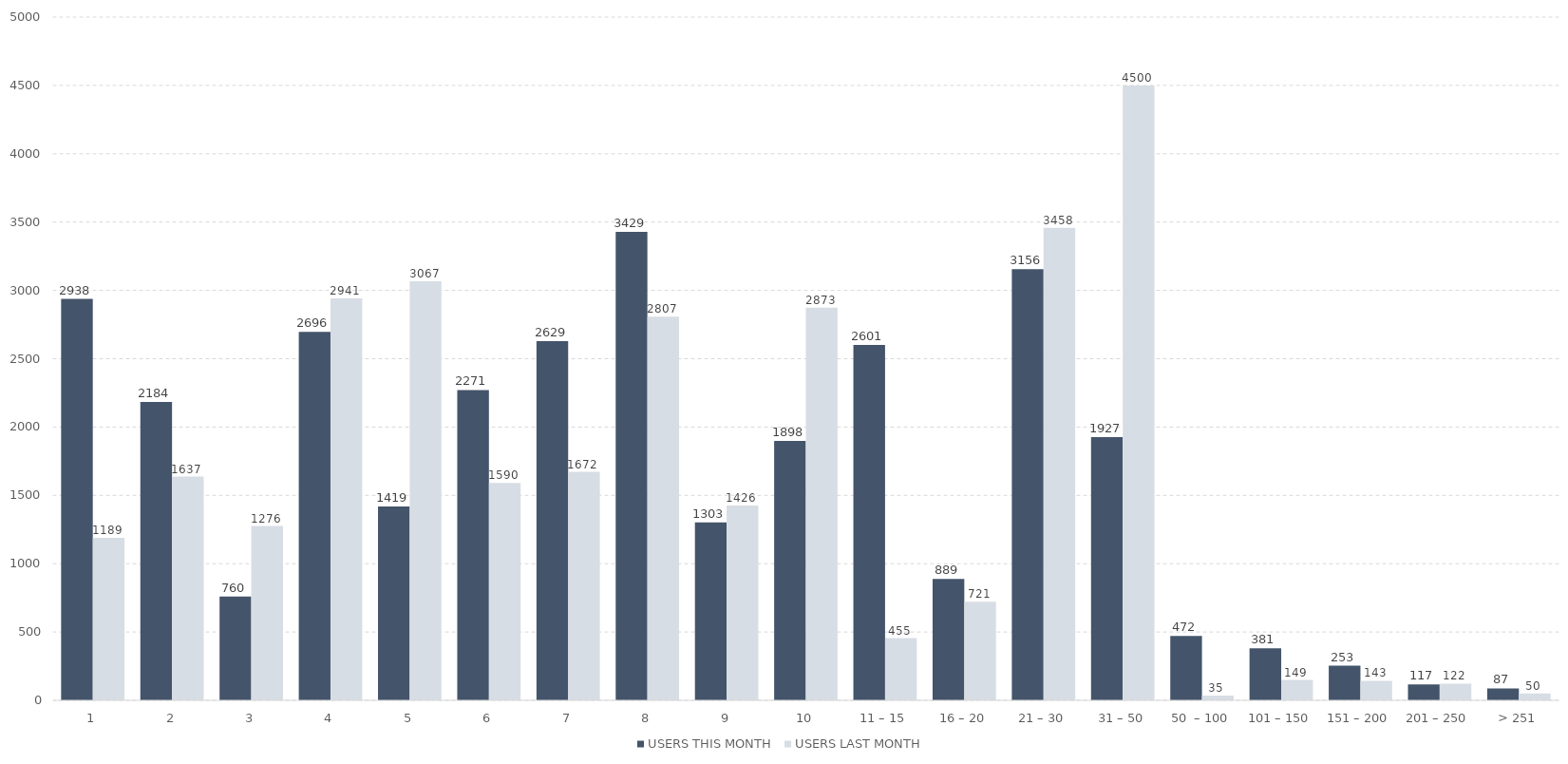
| Category | USERS THIS MONTH | USERS LAST MONTH |
|---|---|---|
| 1 | 2938 | 1189 |
| 2 | 2184 | 1637 |
| 3 | 760 | 1276 |
| 4 | 2696 | 2941 |
| 5 | 1419 | 3067 |
| 6 | 2271 | 1590 |
| 7 | 2629 | 1672 |
| 8 | 3429 | 2807 |
| 9 | 1303 | 1426 |
| 10 | 1898 | 2873 |
| 11 – 15 | 2601 | 455 |
| 16 – 20 | 889 | 721 |
| 21 – 30 | 3156 | 3458 |
| 31 – 50 | 1927 | 4500 |
| 50  – 100 | 472 | 35 |
| 101 – 150 | 381 | 149 |
| 151 – 200 | 253 | 143 |
| 201 – 250 | 117 | 122 |
| > 251 | 87 | 50 |